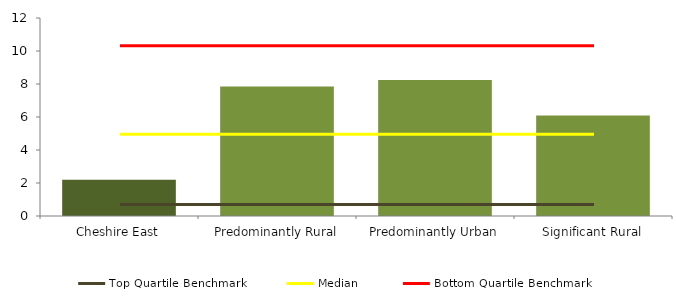
| Category | Series 0 |
|---|---|
| Cheshire East | 2.2 |
| Predominantly Rural | 7.845 |
| Predominantly Urban | 8.247 |
| Significant Rural | 6.09 |